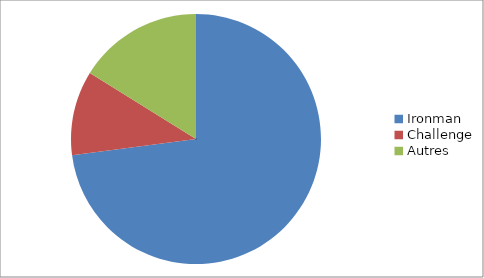
| Category | Series 0 |
|---|---|
| Ironman | 140 |
| Challenge | 21 |
| Autres | 31 |